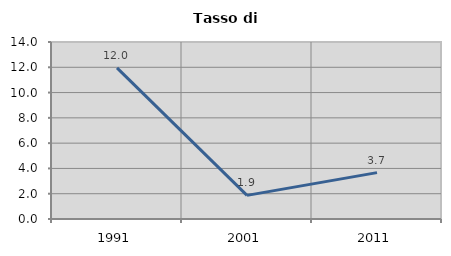
| Category | Tasso di disoccupazione   |
|---|---|
| 1991.0 | 11.957 |
| 2001.0 | 1.869 |
| 2011.0 | 3.67 |